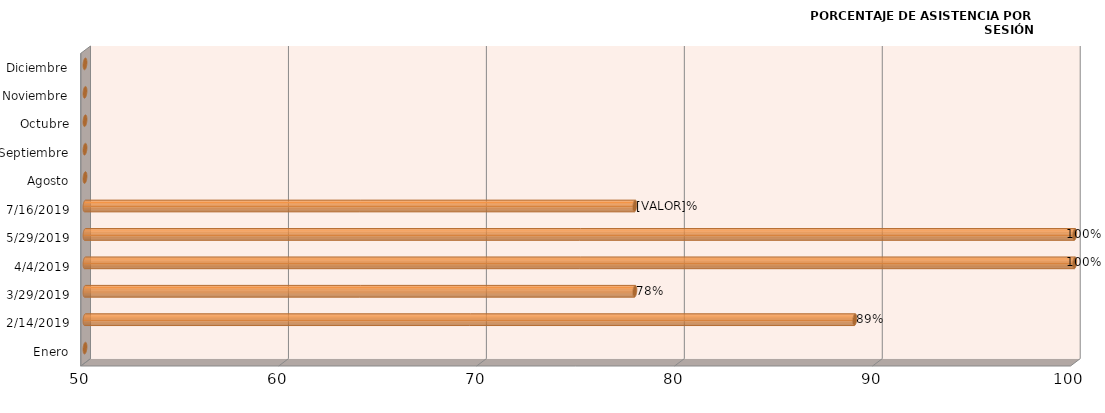
| Category | Series 0 |
|---|---|
| Enero | 0 |
| 14/02/2019 | 88.889 |
| 29/03/2019 | 77.778 |
| 04/04/2019 | 100 |
| 29/05/2019 | 100 |
| 16/07/2019 | 77.778 |
| Agosto | 0 |
| Septiembre | 0 |
| Octubre | 0 |
| Noviembre | 0 |
| Diciembre | 0 |